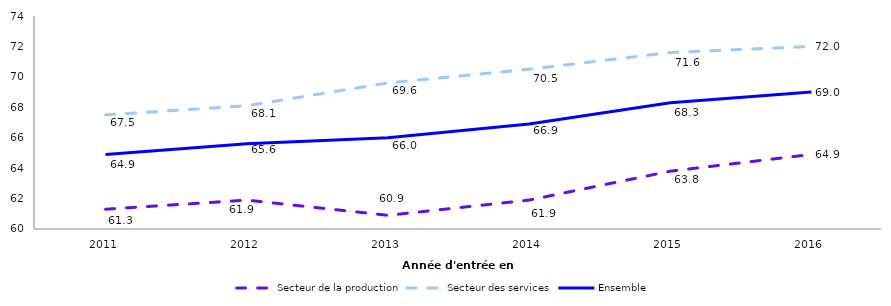
| Category | Secteur de la production | Secteur des services | Ensemble |
|---|---|---|---|
| 2011.0 | 61.3 | 67.5 | 64.9 |
| 2012.0 | 61.9 | 68.1 | 65.6 |
| 2013.0 | 60.9 | 69.6 | 66 |
| 2014.0 | 61.9 | 70.5 | 66.9 |
| 2015.0 | 63.8 | 71.6 | 68.3 |
| 2016.0 | 64.9 | 72 | 69 |